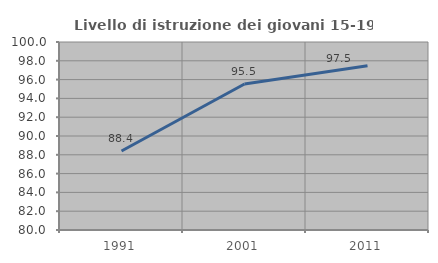
| Category | Livello di istruzione dei giovani 15-19 anni |
|---|---|
| 1991.0 | 88.402 |
| 2001.0 | 95.534 |
| 2011.0 | 97.475 |